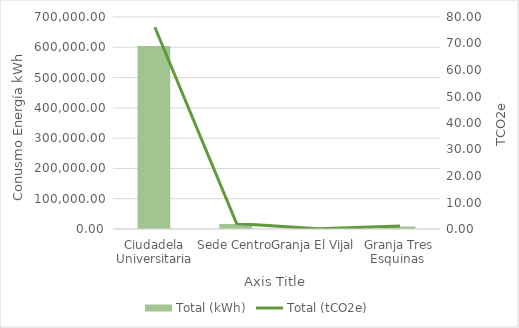
| Category | Total (kWh) |
|---|---|
| Ciudadela Universitaria | 604139 |
| Sede Centro | 16506 |
| Granja El Vijal  | 463 |
| Granja Tres Esquinas  | 8615 |